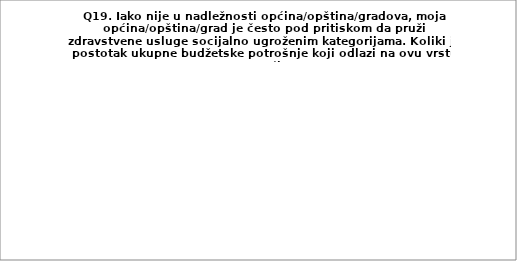
| Category | Series 0 |
|---|---|
| 2% | 44.828 |
| 3% | 13.793 |
| 5% | 12.069 |
| 7% i vise | 6.897 |
| Moja opština/općina/grad nema takva izdvajanja | 22.414 |